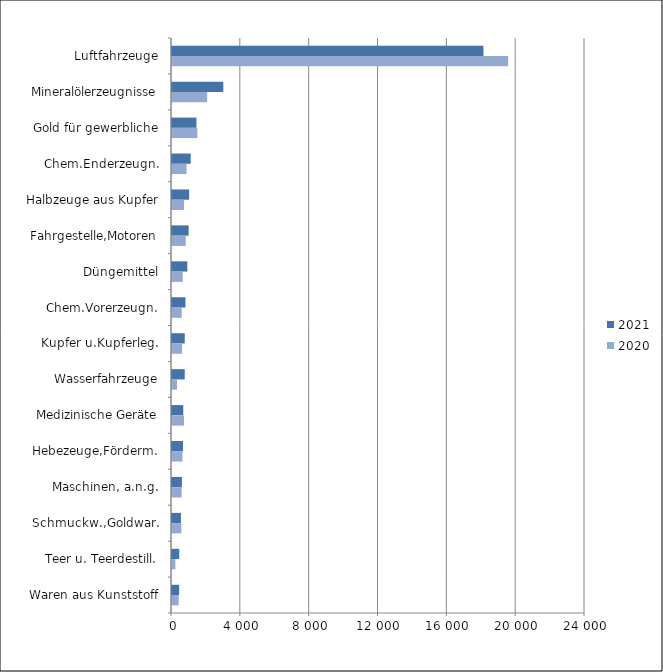
| Category | 2021 | 2020 |
|---|---|---|
| Luftfahrzeuge | 18097.065 | 19533.831 |
| Mineralölerzeugnisse | 2982.466 | 2044.784 |
| Gold für gewerbliche | 1420.022 | 1472.567 |
| Chem.Enderzeugn. | 1087.688 | 843.244 |
| Halbzeuge aus Kupfer | 995.819 | 702.873 |
| Fahrgestelle,Motoren | 967.784 | 798.3 |
| Düngemittel | 891.367 | 623.559 |
| Chem.Vorerzeugn. | 783.076 | 565.129 |
| Kupfer u.Kupferleg. | 740.979 | 583.94 |
| Wasserfahrzeuge | 740.225 | 290.069 |
| Medizinische Geräte | 654.945 | 695.852 |
| Hebezeuge,Förderm. | 639.501 | 607.014 |
| Maschinen, a.n.g. | 576.383 | 559.396 |
| Schmuckw.,Goldwar. | 520.318 | 541.947 |
| Teer u. Teerdestill. | 421.406 | 195.44 |
| Waren aus Kunststoff | 415.596 | 387.265 |